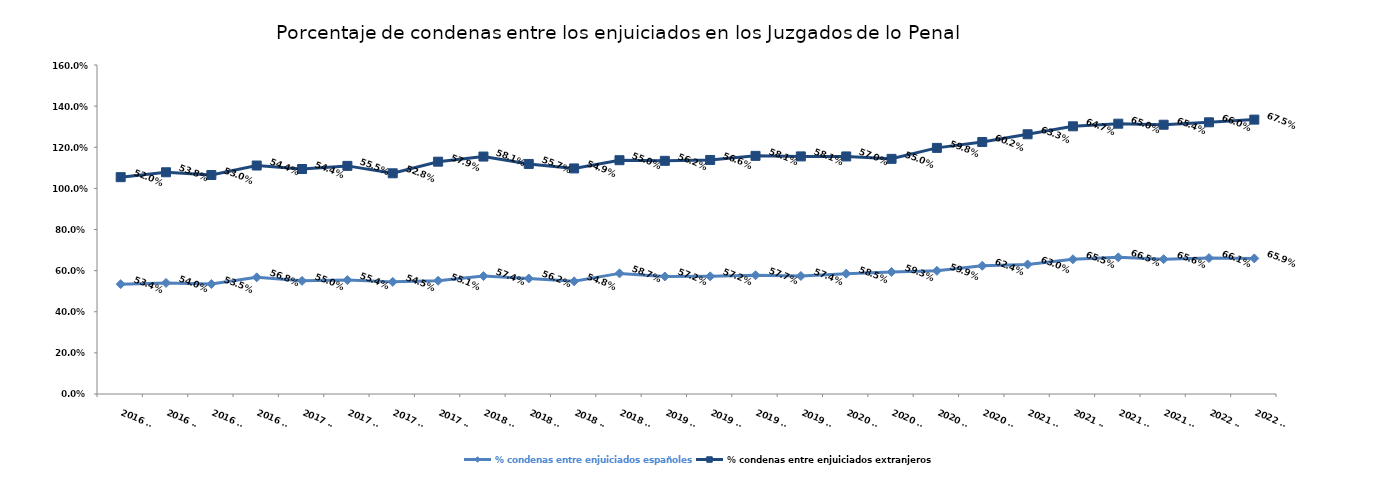
| Category | % condenas entre enjuiciados españoles | % condenas entre enjuiciados extranjeros |
|---|---|---|
| 2016 T1 | 0.534 | 0.52 |
| 2016 T2 | 0.54 | 0.538 |
| 2016 T3 | 0.535 | 0.53 |
| 2016 T4 | 0.568 | 0.544 |
| 2017 T1 | 0.55 | 0.544 |
| 2017 T2 | 0.554 | 0.555 |
| 2017 T3 | 0.545 | 0.528 |
| 2017 T4 | 0.551 | 0.579 |
| 2018 T1 | 0.574 | 0.581 |
| 2018 T2 | 0.562 | 0.557 |
| 2018 T3 | 0.548 | 0.549 |
| 2018 T4 | 0.587 | 0.55 |
| 2019 T1 | 0.572 | 0.562 |
| 2019 T2 | 0.572 | 0.566 |
| 2019 T3 | 0.577 | 0.581 |
| 2019 T4 | 0.574 | 0.581 |
| 2020 T1 | 0.585 | 0.57 |
| 2020 T2 | 0.593 | 0.55 |
| 2020 T3 | 0.599 | 0.598 |
| 2020 T4 | 0.624 | 0.602 |
| 2021 T1 | 0.63 | 0.633 |
| 2021 T2 | 0.655 | 0.647 |
| 2021 T3 | 0.665 | 0.65 |
| 2021 T4 | 0.656 | 0.654 |
| 2022 T1 | 0.661 | 0.66 |
| 2022 T2 | 0.659 | 0.675 |